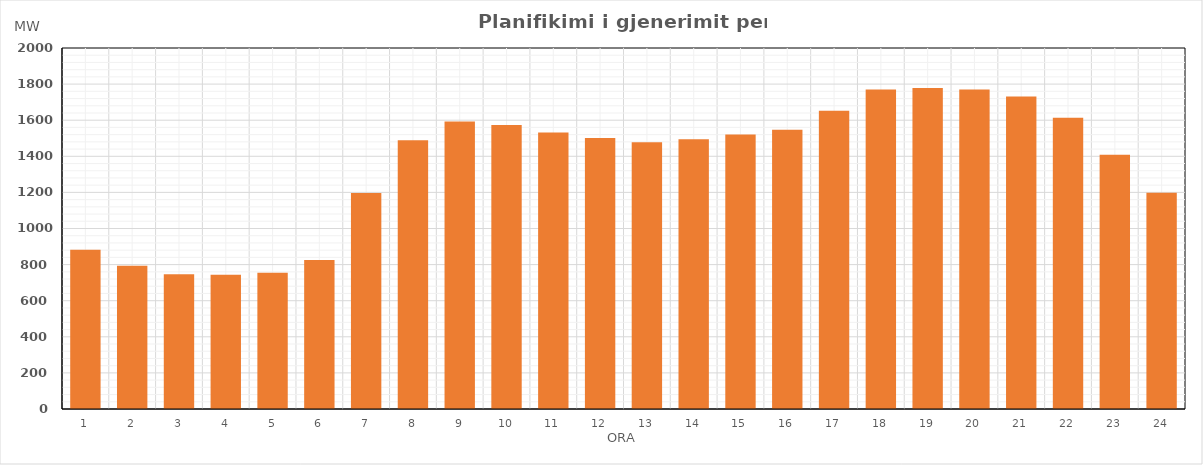
| Category | Max (MW) |
|---|---|
| 0 | 882.22 |
| 1 | 794.02 |
| 2 | 746.82 |
| 3 | 743.31 |
| 4 | 755.21 |
| 5 | 824.8 |
| 6 | 1196.99 |
| 7 | 1488.36 |
| 8 | 1592.12 |
| 9 | 1573.06 |
| 10 | 1531.55 |
| 11 | 1501.1 |
| 12 | 1478.53 |
| 13 | 1494.93 |
| 14 | 1521.2 |
| 15 | 1547.27 |
| 16 | 1652 |
| 17 | 1770.4 |
| 18 | 1778.91 |
| 19 | 1770.04 |
| 20 | 1731.81 |
| 21 | 1613.73 |
| 22 | 1408.3 |
| 23 | 1197.68 |